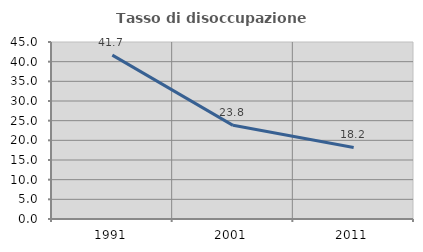
| Category | Tasso di disoccupazione giovanile  |
|---|---|
| 1991.0 | 41.667 |
| 2001.0 | 23.81 |
| 2011.0 | 18.182 |